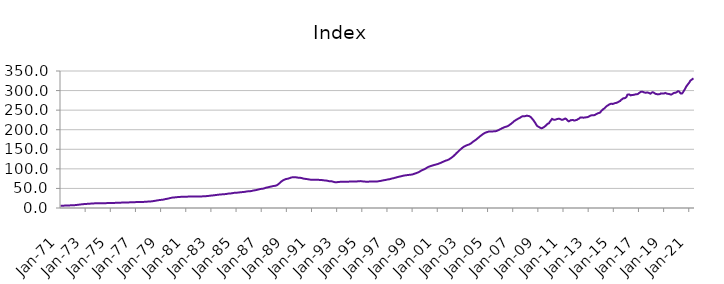
| Category | Index |
|---|---|
| 1971-01-01 | 5.879 |
| 1971-02-01 | 5.921 |
| 1971-03-01 | 5.963 |
| 1971-04-01 | 6.018 |
| 1971-05-01 | 6.108 |
| 1971-06-01 | 6.203 |
| 1971-07-01 | 6.32 |
| 1971-08-01 | 6.446 |
| 1971-09-01 | 6.572 |
| 1971-10-01 | 6.703 |
| 1971-11-01 | 6.844 |
| 1971-12-01 | 7.015 |
| 1972-01-01 | 7.135 |
| 1972-02-01 | 7.213 |
| 1972-03-01 | 7.39 |
| 1972-04-01 | 7.638 |
| 1972-05-01 | 7.997 |
| 1972-06-01 | 8.312 |
| 1972-07-01 | 8.674 |
| 1972-08-01 | 9.023 |
| 1972-09-01 | 9.332 |
| 1972-10-01 | 9.62 |
| 1972-11-01 | 9.887 |
| 1972-12-01 | 10.162 |
| 1973-01-01 | 10.359 |
| 1973-02-01 | 10.498 |
| 1973-03-01 | 10.658 |
| 1973-04-01 | 10.841 |
| 1973-05-01 | 11.075 |
| 1973-06-01 | 11.227 |
| 1973-07-01 | 11.386 |
| 1973-08-01 | 11.562 |
| 1973-09-01 | 11.768 |
| 1973-10-01 | 11.982 |
| 1973-11-01 | 12.145 |
| 1973-12-01 | 12.262 |
| 1974-01-01 | 12.324 |
| 1974-02-01 | 12.392 |
| 1974-03-01 | 12.389 |
| 1974-04-01 | 12.362 |
| 1974-05-01 | 12.339 |
| 1974-06-01 | 12.34 |
| 1974-07-01 | 12.352 |
| 1974-08-01 | 12.392 |
| 1974-09-01 | 12.465 |
| 1974-10-01 | 12.555 |
| 1974-11-01 | 12.63 |
| 1974-12-01 | 12.703 |
| 1975-01-01 | 12.737 |
| 1975-02-01 | 12.78 |
| 1975-03-01 | 12.857 |
| 1975-04-01 | 12.965 |
| 1975-05-01 | 13.097 |
| 1975-06-01 | 13.168 |
| 1975-07-01 | 13.237 |
| 1975-08-01 | 13.332 |
| 1975-09-01 | 13.462 |
| 1975-10-01 | 13.606 |
| 1975-11-01 | 13.732 |
| 1975-12-01 | 13.867 |
| 1976-01-01 | 13.963 |
| 1976-02-01 | 14.052 |
| 1976-03-01 | 14.114 |
| 1976-04-01 | 14.179 |
| 1976-05-01 | 14.264 |
| 1976-06-01 | 14.32 |
| 1976-07-01 | 14.382 |
| 1976-08-01 | 14.474 |
| 1976-09-01 | 14.605 |
| 1976-10-01 | 14.752 |
| 1976-11-01 | 14.87 |
| 1976-12-01 | 14.976 |
| 1977-01-01 | 15.034 |
| 1977-02-01 | 15.102 |
| 1977-03-01 | 15.145 |
| 1977-04-01 | 15.197 |
| 1977-05-01 | 15.276 |
| 1977-06-01 | 15.347 |
| 1977-07-01 | 15.436 |
| 1977-08-01 | 15.557 |
| 1977-09-01 | 15.705 |
| 1977-10-01 | 15.871 |
| 1977-11-01 | 16.048 |
| 1977-12-01 | 16.278 |
| 1978-01-01 | 16.449 |
| 1978-02-01 | 16.582 |
| 1978-03-01 | 16.762 |
| 1978-04-01 | 17.003 |
| 1978-05-01 | 17.391 |
| 1978-06-01 | 17.783 |
| 1978-07-01 | 18.258 |
| 1978-08-01 | 18.744 |
| 1978-09-01 | 19.213 |
| 1978-10-01 | 19.678 |
| 1978-11-01 | 20.113 |
| 1978-12-01 | 20.542 |
| 1979-01-01 | 20.797 |
| 1979-02-01 | 20.968 |
| 1979-03-01 | 21.394 |
| 1979-04-01 | 21.979 |
| 1979-05-01 | 22.725 |
| 1979-06-01 | 23.198 |
| 1979-07-01 | 23.69 |
| 1979-08-01 | 24.243 |
| 1979-09-01 | 24.906 |
| 1979-10-01 | 25.613 |
| 1979-11-01 | 26.202 |
| 1979-12-01 | 26.66 |
| 1980-01-01 | 26.911 |
| 1980-02-01 | 27.107 |
| 1980-03-01 | 27.357 |
| 1980-04-01 | 27.651 |
| 1980-05-01 | 27.994 |
| 1980-06-01 | 28.178 |
| 1980-07-01 | 28.344 |
| 1980-08-01 | 28.498 |
| 1980-09-01 | 28.607 |
| 1980-10-01 | 28.676 |
| 1980-11-01 | 28.73 |
| 1980-12-01 | 28.843 |
| 1981-01-01 | 28.911 |
| 1981-02-01 | 29.013 |
| 1981-03-01 | 29.116 |
| 1981-04-01 | 29.254 |
| 1981-05-01 | 29.394 |
| 1981-06-01 | 29.441 |
| 1981-07-01 | 29.464 |
| 1981-08-01 | 29.469 |
| 1981-09-01 | 29.414 |
| 1981-10-01 | 29.312 |
| 1981-11-01 | 29.219 |
| 1981-12-01 | 29.209 |
| 1982-01-01 | 29.164 |
| 1982-02-01 | 29.184 |
| 1982-03-01 | 29.346 |
| 1982-04-01 | 29.618 |
| 1982-05-01 | 29.924 |
| 1982-06-01 | 30.035 |
| 1982-07-01 | 30.119 |
| 1982-08-01 | 30.28 |
| 1982-09-01 | 30.54 |
| 1982-10-01 | 30.849 |
| 1982-11-01 | 31.157 |
| 1982-12-01 | 31.538 |
| 1983-01-01 | 31.828 |
| 1983-02-01 | 32.078 |
| 1983-03-01 | 32.337 |
| 1983-04-01 | 32.659 |
| 1983-05-01 | 33.081 |
| 1983-06-01 | 33.413 |
| 1983-07-01 | 33.773 |
| 1983-08-01 | 34.116 |
| 1983-09-01 | 34.39 |
| 1983-10-01 | 34.614 |
| 1983-11-01 | 34.826 |
| 1983-12-01 | 35.104 |
| 1984-01-01 | 35.27 |
| 1984-02-01 | 35.438 |
| 1984-03-01 | 35.758 |
| 1984-04-01 | 36.202 |
| 1984-05-01 | 36.71 |
| 1984-06-01 | 36.936 |
| 1984-07-01 | 37.124 |
| 1984-08-01 | 37.411 |
| 1984-09-01 | 37.87 |
| 1984-10-01 | 38.4 |
| 1984-11-01 | 38.81 |
| 1984-12-01 | 39.095 |
| 1985-01-01 | 39.174 |
| 1985-02-01 | 39.283 |
| 1985-03-01 | 39.552 |
| 1985-04-01 | 39.93 |
| 1985-05-01 | 40.361 |
| 1985-06-01 | 40.527 |
| 1985-07-01 | 40.681 |
| 1985-08-01 | 40.948 |
| 1985-09-01 | 41.393 |
| 1985-10-01 | 41.902 |
| 1985-11-01 | 42.329 |
| 1985-12-01 | 42.671 |
| 1986-01-01 | 42.803 |
| 1986-02-01 | 42.939 |
| 1986-03-01 | 43.335 |
| 1986-04-01 | 43.908 |
| 1986-05-01 | 44.624 |
| 1986-06-01 | 45.057 |
| 1986-07-01 | 45.499 |
| 1986-08-01 | 46.028 |
| 1986-09-01 | 46.692 |
| 1986-10-01 | 47.409 |
| 1986-11-01 | 48.06 |
| 1986-12-01 | 48.667 |
| 1987-01-01 | 49.02 |
| 1987-02-01 | 49.311 |
| 1987-03-01 | 49.944 |
| 1987-04-01 | 50.795 |
| 1987-05-01 | 51.813 |
| 1987-06-01 | 52.387 |
| 1987-07-01 | 52.937 |
| 1987-08-01 | 53.541 |
| 1987-09-01 | 54.197 |
| 1987-10-01 | 54.877 |
| 1987-11-01 | 55.513 |
| 1987-12-01 | 56.172 |
| 1988-01-01 | 56.486 |
| 1988-02-01 | 56.756 |
| 1988-03-01 | 57.701 |
| 1988-04-01 | 59.124 |
| 1988-05-01 | 61.264 |
| 1988-06-01 | 63.424 |
| 1988-07-01 | 65.968 |
| 1988-08-01 | 68.307 |
| 1988-09-01 | 70.109 |
| 1988-10-01 | 71.604 |
| 1988-11-01 | 72.807 |
| 1988-12-01 | 73.875 |
| 1989-01-01 | 74.434 |
| 1989-02-01 | 74.906 |
| 1989-03-01 | 75.707 |
| 1989-04-01 | 76.727 |
| 1989-05-01 | 77.807 |
| 1989-06-01 | 78.279 |
| 1989-07-01 | 78.601 |
| 1989-08-01 | 78.752 |
| 1989-09-01 | 78.622 |
| 1989-10-01 | 78.258 |
| 1989-11-01 | 77.774 |
| 1989-12-01 | 77.38 |
| 1990-01-01 | 77.025 |
| 1990-02-01 | 77.011 |
| 1990-03-01 | 76.482 |
| 1990-04-01 | 75.796 |
| 1990-05-01 | 74.994 |
| 1990-06-01 | 74.611 |
| 1990-07-01 | 74.285 |
| 1990-08-01 | 73.967 |
| 1990-09-01 | 73.52 |
| 1990-10-01 | 73.009 |
| 1990-11-01 | 72.535 |
| 1990-12-01 | 72.334 |
| 1991-01-01 | 72.192 |
| 1991-02-01 | 72.268 |
| 1991-03-01 | 72.153 |
| 1991-04-01 | 72.077 |
| 1991-05-01 | 71.977 |
| 1991-06-01 | 71.933 |
| 1991-07-01 | 71.885 |
| 1991-08-01 | 71.819 |
| 1991-09-01 | 71.705 |
| 1991-10-01 | 71.501 |
| 1991-11-01 | 71.166 |
| 1991-12-01 | 70.813 |
| 1992-01-01 | 70.463 |
| 1992-02-01 | 70.409 |
| 1992-03-01 | 69.918 |
| 1992-04-01 | 69.325 |
| 1992-05-01 | 68.671 |
| 1992-06-01 | 68.457 |
| 1992-07-01 | 68.303 |
| 1992-08-01 | 67.98 |
| 1992-09-01 | 67.29 |
| 1992-10-01 | 66.434 |
| 1992-11-01 | 65.854 |
| 1992-12-01 | 65.871 |
| 1993-01-01 | 66.034 |
| 1993-02-01 | 66.322 |
| 1993-03-01 | 66.581 |
| 1993-04-01 | 66.905 |
| 1993-05-01 | 67.182 |
| 1993-06-01 | 67.213 |
| 1993-07-01 | 67.233 |
| 1993-08-01 | 67.289 |
| 1993-09-01 | 67.247 |
| 1993-10-01 | 67.126 |
| 1993-11-01 | 67.046 |
| 1993-12-01 | 67.281 |
| 1994-01-01 | 67.604 |
| 1994-02-01 | 68.006 |
| 1994-03-01 | 67.991 |
| 1994-04-01 | 67.827 |
| 1994-05-01 | 67.683 |
| 1994-06-01 | 67.696 |
| 1994-07-01 | 67.777 |
| 1994-08-01 | 67.944 |
| 1994-09-01 | 68.21 |
| 1994-10-01 | 68.532 |
| 1994-11-01 | 68.685 |
| 1994-12-01 | 68.595 |
| 1995-01-01 | 68.092 |
| 1995-02-01 | 67.66 |
| 1995-03-01 | 67.497 |
| 1995-04-01 | 67.327 |
| 1995-05-01 | 67.356 |
| 1995-06-01 | 67.213 |
| 1995-07-01 | 67.36 |
| 1995-08-01 | 67.425 |
| 1995-09-01 | 67.463 |
| 1995-10-01 | 67.439 |
| 1995-11-01 | 67.524 |
| 1995-12-01 | 67.607 |
| 1996-01-01 | 67.632 |
| 1996-02-01 | 67.59 |
| 1996-03-01 | 67.814 |
| 1996-04-01 | 68.077 |
| 1996-05-01 | 68.578 |
| 1996-06-01 | 68.945 |
| 1996-07-01 | 69.543 |
| 1996-08-01 | 70.122 |
| 1996-09-01 | 70.708 |
| 1996-10-01 | 71.134 |
| 1996-11-01 | 71.585 |
| 1996-12-01 | 72.224 |
| 1997-01-01 | 72.682 |
| 1997-02-01 | 73.17 |
| 1997-03-01 | 73.587 |
| 1997-04-01 | 74.264 |
| 1997-05-01 | 75.148 |
| 1997-06-01 | 75.819 |
| 1997-07-01 | 76.292 |
| 1997-08-01 | 77.048 |
| 1997-09-01 | 77.723 |
| 1997-10-01 | 78.598 |
| 1997-11-01 | 79.21 |
| 1997-12-01 | 79.988 |
| 1998-01-01 | 80.449 |
| 1998-02-01 | 81.141 |
| 1998-03-01 | 81.745 |
| 1998-04-01 | 82.495 |
| 1998-05-01 | 83.027 |
| 1998-06-01 | 83.355 |
| 1998-07-01 | 83.747 |
| 1998-08-01 | 84.113 |
| 1998-09-01 | 84.484 |
| 1998-10-01 | 84.731 |
| 1998-11-01 | 85.018 |
| 1998-12-01 | 85.363 |
| 1999-01-01 | 85.875 |
| 1999-02-01 | 86.896 |
| 1999-03-01 | 87.796 |
| 1999-04-01 | 88.688 |
| 1999-05-01 | 89.666 |
| 1999-06-01 | 90.701 |
| 1999-07-01 | 91.918 |
| 1999-08-01 | 93.495 |
| 1999-09-01 | 95.101 |
| 1999-10-01 | 96.577 |
| 1999-11-01 | 97.58 |
| 1999-12-01 | 98.926 |
| 2000-01-01 | 100 |
| 2000-02-01 | 101.936 |
| 2000-03-01 | 103.455 |
| 2000-04-01 | 105.075 |
| 2000-05-01 | 105.895 |
| 2000-06-01 | 106.901 |
| 2000-07-01 | 107.798 |
| 2000-08-01 | 108.633 |
| 2000-09-01 | 109.409 |
| 2000-10-01 | 110.207 |
| 2000-11-01 | 110.863 |
| 2000-12-01 | 111.699 |
| 2001-01-01 | 112.376 |
| 2001-02-01 | 113.427 |
| 2001-03-01 | 114.41 |
| 2001-04-01 | 115.617 |
| 2001-05-01 | 116.92 |
| 2001-06-01 | 118 |
| 2001-07-01 | 119.178 |
| 2001-08-01 | 120.352 |
| 2001-09-01 | 121.415 |
| 2001-10-01 | 122.129 |
| 2001-11-01 | 123.346 |
| 2001-12-01 | 124.695 |
| 2002-01-01 | 126.498 |
| 2002-02-01 | 128.249 |
| 2002-03-01 | 130.341 |
| 2002-04-01 | 132.594 |
| 2002-05-01 | 135.137 |
| 2002-06-01 | 137.714 |
| 2002-07-01 | 140.534 |
| 2002-08-01 | 143.04 |
| 2002-09-01 | 145.7 |
| 2002-10-01 | 148.191 |
| 2002-11-01 | 150.379 |
| 2002-12-01 | 152.788 |
| 2003-01-01 | 154.938 |
| 2003-02-01 | 156.702 |
| 2003-03-01 | 158.127 |
| 2003-04-01 | 159.492 |
| 2003-05-01 | 160.649 |
| 2003-06-01 | 161.58 |
| 2003-07-01 | 162.401 |
| 2003-08-01 | 164.014 |
| 2003-09-01 | 165.699 |
| 2003-10-01 | 167.901 |
| 2003-11-01 | 170.039 |
| 2003-12-01 | 171.829 |
| 2004-01-01 | 173.609 |
| 2004-02-01 | 175.589 |
| 2004-03-01 | 177.991 |
| 2004-04-01 | 180.138 |
| 2004-05-01 | 182.465 |
| 2004-06-01 | 184.54 |
| 2004-07-01 | 186.551 |
| 2004-08-01 | 188.625 |
| 2004-09-01 | 190.257 |
| 2004-10-01 | 192.019 |
| 2004-11-01 | 192.962 |
| 2004-12-01 | 193.904 |
| 2005-01-01 | 194.627 |
| 2005-02-01 | 195.72 |
| 2005-03-01 | 195.655 |
| 2005-04-01 | 195.754 |
| 2005-05-01 | 195.194 |
| 2005-06-01 | 195.793 |
| 2005-07-01 | 195.867 |
| 2005-08-01 | 196.175 |
| 2005-09-01 | 196.736 |
| 2005-10-01 | 197.938 |
| 2005-11-01 | 198.884 |
| 2005-12-01 | 200.645 |
| 2006-01-01 | 201.661 |
| 2006-02-01 | 203.374 |
| 2006-03-01 | 204.511 |
| 2006-04-01 | 205.861 |
| 2006-05-01 | 206.826 |
| 2006-06-01 | 207.511 |
| 2006-07-01 | 208.388 |
| 2006-08-01 | 209.567 |
| 2006-09-01 | 211.353 |
| 2006-10-01 | 213.443 |
| 2006-11-01 | 215.14 |
| 2006-12-01 | 217.475 |
| 2007-01-01 | 219.496 |
| 2007-02-01 | 222.231 |
| 2007-03-01 | 223.7 |
| 2007-04-01 | 225.58 |
| 2007-05-01 | 226.869 |
| 2007-06-01 | 228.812 |
| 2007-07-01 | 229.701 |
| 2007-08-01 | 231.63 |
| 2007-09-01 | 233.384 |
| 2007-10-01 | 234.664 |
| 2007-11-01 | 234.312 |
| 2007-12-01 | 234.555 |
| 2008-01-01 | 235.086 |
| 2008-02-01 | 236.026 |
| 2008-03-01 | 235.364 |
| 2008-04-01 | 234.965 |
| 2008-05-01 | 233.6 |
| 2008-06-01 | 231.702 |
| 2008-07-01 | 228.29 |
| 2008-08-01 | 225.152 |
| 2008-09-01 | 221.485 |
| 2008-10-01 | 217.485 |
| 2008-11-01 | 212.758 |
| 2008-12-01 | 209.323 |
| 2009-01-01 | 207.652 |
| 2009-02-01 | 206.212 |
| 2009-03-01 | 204.576 |
| 2009-04-01 | 203.86 |
| 2009-05-01 | 204.572 |
| 2009-06-01 | 206.247 |
| 2009-07-01 | 207.906 |
| 2009-08-01 | 210.209 |
| 2009-09-01 | 213.072 |
| 2009-10-01 | 215.548 |
| 2009-11-01 | 216.169 |
| 2009-12-01 | 220.435 |
| 2010-01-01 | 223.882 |
| 2010-02-01 | 227.544 |
| 2010-03-01 | 226.207 |
| 2010-04-01 | 225.371 |
| 2010-05-01 | 225.616 |
| 2010-06-01 | 226.496 |
| 2010-07-01 | 227.242 |
| 2010-08-01 | 228.031 |
| 2010-09-01 | 227.934 |
| 2010-10-01 | 227.086 |
| 2010-11-01 | 225.565 |
| 2010-12-01 | 225.596 |
| 2011-01-01 | 226.214 |
| 2011-02-01 | 228.039 |
| 2011-03-01 | 228.503 |
| 2011-04-01 | 226.162 |
| 2011-05-01 | 223.102 |
| 2011-06-01 | 221.419 |
| 2011-07-01 | 222.781 |
| 2011-08-01 | 224.513 |
| 2011-09-01 | 224.472 |
| 2011-10-01 | 224.841 |
| 2011-11-01 | 223.579 |
| 2011-12-01 | 223.822 |
| 2012-01-01 | 224.584 |
| 2012-02-01 | 225.473 |
| 2012-03-01 | 227.466 |
| 2012-04-01 | 228.575 |
| 2012-05-01 | 231.11 |
| 2012-06-01 | 231.251 |
| 2012-07-01 | 231.282 |
| 2012-08-01 | 230.612 |
| 2012-09-01 | 231.126 |
| 2012-10-01 | 231.503 |
| 2012-11-01 | 231.747 |
| 2012-12-01 | 232.346 |
| 2013-01-01 | 233.26 |
| 2013-02-01 | 235.199 |
| 2013-03-01 | 236.287 |
| 2013-04-01 | 236.897 |
| 2013-05-01 | 236.822 |
| 2013-06-01 | 237.016 |
| 2013-07-01 | 237.888 |
| 2013-08-01 | 239.493 |
| 2013-09-01 | 240.786 |
| 2013-10-01 | 242.115 |
| 2013-11-01 | 242.898 |
| 2013-12-01 | 244.057 |
| 2014-01-01 | 247.816 |
| 2014-02-01 | 250.169 |
| 2014-03-01 | 252.769 |
| 2014-04-01 | 254.326 |
| 2014-05-01 | 257.246 |
| 2014-06-01 | 260.069 |
| 2014-07-01 | 261.53 |
| 2014-08-01 | 263.472 |
| 2014-09-01 | 264.905 |
| 2014-10-01 | 266.07 |
| 2014-11-01 | 266.347 |
| 2014-12-01 | 265.659 |
| 2015-01-01 | 266.928 |
| 2015-02-01 | 267.88 |
| 2015-03-01 | 268.307 |
| 2015-04-01 | 269.155 |
| 2015-05-01 | 270.34 |
| 2015-06-01 | 272.163 |
| 2015-07-01 | 273.277 |
| 2015-08-01 | 276.288 |
| 2015-09-01 | 278.116 |
| 2015-10-01 | 280.486 |
| 2015-11-01 | 280.294 |
| 2015-12-01 | 281.199 |
| 2016-01-01 | 283.607 |
| 2016-02-01 | 289.619 |
| 2016-03-01 | 290.057 |
| 2016-04-01 | 289.886 |
| 2016-05-01 | 287.681 |
| 2016-06-01 | 288.483 |
| 2016-07-01 | 288.661 |
| 2016-08-01 | 289.259 |
| 2016-09-01 | 289.711 |
| 2016-10-01 | 290.701 |
| 2016-11-01 | 290.463 |
| 2016-12-01 | 291.375 |
| 2017-01-01 | 293.717 |
| 2017-02-01 | 295.456 |
| 2017-03-01 | 297.078 |
| 2017-04-01 | 296.912 |
| 2017-05-01 | 296.553 |
| 2017-06-01 | 295.078 |
| 2017-07-01 | 294.677 |
| 2017-08-01 | 294.669 |
| 2017-09-01 | 295.305 |
| 2017-10-01 | 294.345 |
| 2017-11-01 | 293.162 |
| 2017-12-01 | 292.069 |
| 2018-01-01 | 294.449 |
| 2018-02-01 | 295.846 |
| 2018-03-01 | 294.92 |
| 2018-04-01 | 292.924 |
| 2018-05-01 | 291.472 |
| 2018-06-01 | 291.002 |
| 2018-07-01 | 290.236 |
| 2018-08-01 | 290.758 |
| 2018-09-01 | 291.058 |
| 2018-10-01 | 292.824 |
| 2018-11-01 | 292.65 |
| 2018-12-01 | 292.367 |
| 2019-01-01 | 292.519 |
| 2019-02-01 | 293.9 |
| 2019-03-01 | 292.871 |
| 2019-04-01 | 291.841 |
| 2019-05-01 | 291.513 |
| 2019-06-01 | 290.998 |
| 2019-07-01 | 290.148 |
| 2019-08-01 | 289.99 |
| 2019-09-01 | 291.573 |
| 2019-10-01 | 293.571 |
| 2019-11-01 | 294.348 |
| 2019-12-01 | 294.551 |
| 2020-01-01 | 295.866 |
| 2020-02-01 | 298.222 |
| 2020-03-01 | 298.209 |
| 2020-04-01 | 295.219 |
| 2020-05-01 | 292.362 |
| 2020-06-01 | 292.368 |
| 2020-07-01 | 295.543 |
| 2020-08-01 | 300.082 |
| 2020-09-01 | 304.427 |
| 2020-10-01 | 309.885 |
| 2020-11-01 | 313.48 |
| 2020-12-01 | 317.137 |
| 2021-01-01 | 320.468 |
| 2021-02-01 | 325.378 |
| 2021-03-01 | 327.18 |
| 2021-04-01 | 329.342 |
| 2021-05-01 | 331.11 |